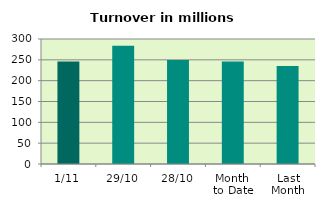
| Category | Series 0 |
|---|---|
| 1/11 | 246.29 |
| 29/10 | 284.052 |
| 28/10 | 249.477 |
| Month 
to Date | 246.29 |
| Last
Month | 235.36 |